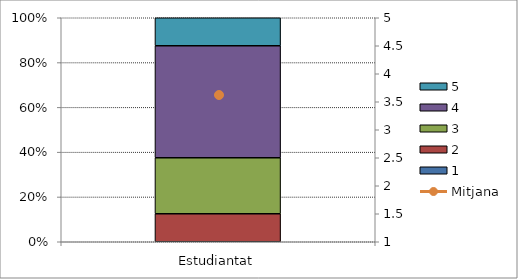
| Category | 1 | 2 | 3 | 4 | 5 |
|---|---|---|---|---|---|
| Estudiantat | 0 | 1 | 2 | 4 | 1 |